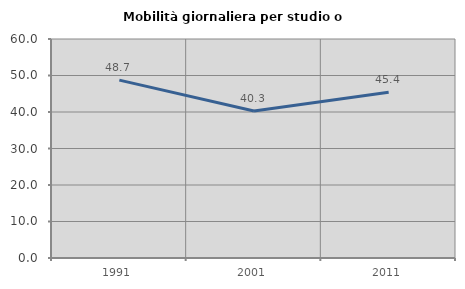
| Category | Mobilità giornaliera per studio o lavoro |
|---|---|
| 1991.0 | 48.74 |
| 2001.0 | 40.282 |
| 2011.0 | 45.415 |